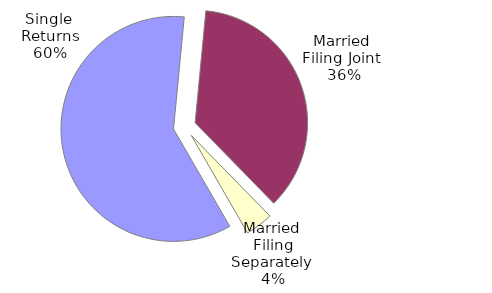
| Category | Series 0 |
|---|---|
| Single 
Returns | 2462598 |
| Married 
Filing Joint  | 1488020 |
| Married 
Filing Separately  | 163551 |